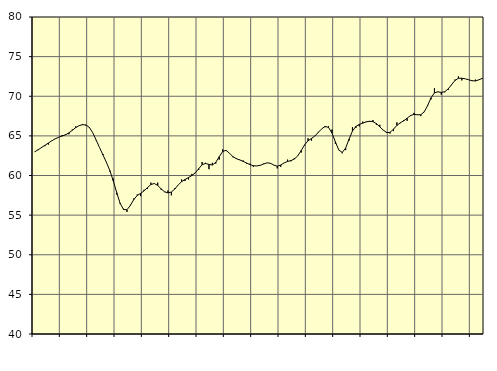
| Category | Piggar | Samtliga anställda (inkl. anställda utomlands) |
|---|---|---|
| nan | 63 | 62.98 |
| 87.0 | 63.2 | 63.26 |
| 87.0 | 63.6 | 63.53 |
| 87.0 | 63.7 | 63.81 |
| nan | 63.9 | 64.1 |
| 88.0 | 64.4 | 64.38 |
| 88.0 | 64.6 | 64.63 |
| 88.0 | 64.8 | 64.82 |
| nan | 65.1 | 64.98 |
| 89.0 | 65.2 | 65.13 |
| 89.0 | 65.2 | 65.38 |
| 89.0 | 65.8 | 65.7 |
| nan | 66.2 | 66.04 |
| 90.0 | 66.3 | 66.29 |
| 90.0 | 66.5 | 66.41 |
| 90.0 | 66.3 | 66.38 |
| nan | 66.1 | 66.06 |
| 91.0 | 65.4 | 65.39 |
| 91.0 | 64.4 | 64.46 |
| 91.0 | 63.5 | 63.5 |
| nan | 62.7 | 62.58 |
| 92.0 | 61.7 | 61.64 |
| 92.0 | 60.5 | 60.61 |
| 92.0 | 59.6 | 59.32 |
| nan | 57.6 | 57.84 |
| 93.0 | 56.4 | 56.49 |
| 93.0 | 55.8 | 55.71 |
| 93.0 | 55.4 | 55.68 |
| nan | 56.3 | 56.23 |
| 94.0 | 57.1 | 56.96 |
| 94.0 | 57.6 | 57.48 |
| 94.0 | 57.4 | 57.75 |
| nan | 58.2 | 58.06 |
| 95.0 | 58.3 | 58.47 |
| 95.0 | 59.1 | 58.86 |
| 95.0 | 59 | 58.99 |
| nan | 59.1 | 58.75 |
| 96.0 | 58.2 | 58.32 |
| 96.0 | 57.9 | 57.95 |
| 96.0 | 58.1 | 57.8 |
| nan | 57.5 | 57.92 |
| 97.0 | 58.4 | 58.29 |
| 97.0 | 58.8 | 58.81 |
| 97.0 | 59.5 | 59.23 |
| nan | 59.3 | 59.5 |
| 98.0 | 59.5 | 59.74 |
| 98.0 | 60.2 | 60 |
| 98.0 | 60.3 | 60.34 |
| nan | 60.7 | 60.86 |
| 99.0 | 61.7 | 61.36 |
| 99.0 | 61.6 | 61.52 |
| 99.0 | 60.8 | 61.4 |
| nan | 61.6 | 61.32 |
| 0.0 | 61.5 | 61.66 |
| 0.0 | 62 | 62.37 |
| 0.0 | 63.3 | 63.02 |
| nan | 63.2 | 63.18 |
| 1.0 | 62.8 | 62.81 |
| 1.0 | 62.3 | 62.38 |
| 1.0 | 62.2 | 62.13 |
| nan | 62 | 61.96 |
| 2.0 | 61.9 | 61.78 |
| 2.0 | 61.5 | 61.58 |
| 2.0 | 61.5 | 61.37 |
| nan | 61.1 | 61.23 |
| 3.0 | 61.2 | 61.21 |
| 3.0 | 61.3 | 61.28 |
| 3.0 | 61.5 | 61.45 |
| nan | 61.6 | 61.6 |
| 4.0 | 61.5 | 61.54 |
| 4.0 | 61.3 | 61.31 |
| 4.0 | 60.9 | 61.17 |
| nan | 61.1 | 61.32 |
| 5.0 | 61.6 | 61.59 |
| 5.0 | 62 | 61.77 |
| 5.0 | 61.8 | 61.88 |
| nan | 62.2 | 62.08 |
| 6.0 | 62.5 | 62.48 |
| 6.0 | 62.9 | 63.15 |
| 6.0 | 63.8 | 63.87 |
| nan | 64.7 | 64.38 |
| 7.0 | 64.4 | 64.67 |
| 7.0 | 65 | 64.98 |
| 7.0 | 65.5 | 65.44 |
| nan | 65.9 | 65.89 |
| 8.0 | 66.1 | 66.19 |
| 8.0 | 66.2 | 66.07 |
| 8.0 | 65.8 | 65.36 |
| nan | 64 | 64.25 |
| 9.0 | 63.2 | 63.22 |
| 9.0 | 62.8 | 62.91 |
| 9.0 | 63.2 | 63.46 |
| nan | 64.4 | 64.58 |
| 10.0 | 66.1 | 65.61 |
| 10.0 | 66 | 66.19 |
| 10.0 | 66.2 | 66.45 |
| nan | 66.8 | 66.6 |
| 11.0 | 66.8 | 66.76 |
| 11.0 | 66.8 | 66.85 |
| 11.0 | 67 | 66.79 |
| nan | 66.4 | 66.55 |
| 12.0 | 66.4 | 66.14 |
| 12.0 | 65.7 | 65.73 |
| 12.0 | 65.5 | 65.42 |
| nan | 65.3 | 65.44 |
| 13.0 | 65.6 | 65.84 |
| 13.0 | 66.7 | 66.32 |
| 13.0 | 66.6 | 66.65 |
| nan | 67 | 66.9 |
| 14.0 | 66.9 | 67.23 |
| 14.0 | 67.5 | 67.57 |
| 14.0 | 67.9 | 67.71 |
| nan | 67.7 | 67.66 |
| 15.0 | 67.5 | 67.67 |
| 15.0 | 68 | 68.03 |
| 15.0 | 68.9 | 68.82 |
| nan | 69.6 | 69.81 |
| 16.0 | 71 | 70.43 |
| 16.0 | 70.6 | 70.56 |
| 16.0 | 70.2 | 70.48 |
| nan | 70.5 | 70.57 |
| 17.0 | 70.8 | 70.92 |
| 17.0 | 71.4 | 71.46 |
| 17.0 | 72.1 | 71.99 |
| nan | 72.5 | 72.26 |
| 18.0 | 72 | 72.28 |
| 18.0 | 72.2 | 72.2 |
| 18.0 | 72.1 | 72.08 |
| nan | 72 | 71.96 |
| 19.0 | 72.1 | 71.93 |
| 19.0 | 72.1 | 72.07 |
| 19.0 | 72.2 | 72.26 |